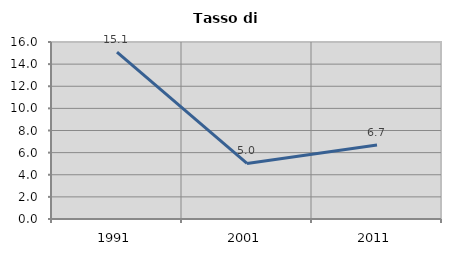
| Category | Tasso di disoccupazione   |
|---|---|
| 1991.0 | 15.088 |
| 2001.0 | 5.021 |
| 2011.0 | 6.696 |